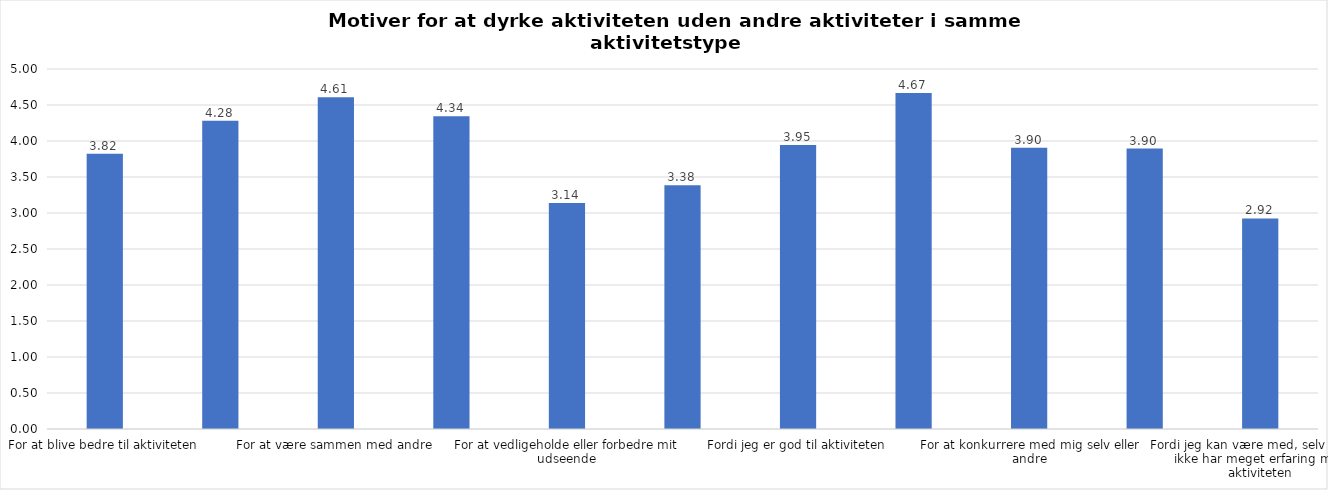
| Category | Gennemsnit |
|---|---|
| For at blive bedre til aktiviteten | 3.821 |
| For at vedligeholde eller forbedre min sundhed (fx helbred, fysisk form) | 4.283 |
| For at være sammen med andre | 4.607 |
| For at gøre noget godt for mig selv | 4.343 |
| For at vedligeholde eller forbedre mit udseende | 3.137 |
| Fordi andre i min omgangskreds opmuntrer mig til det | 3.384 |
| Fordi jeg er god til aktiviteten | 3.946 |
| Fordi jeg godt kan lide aktiviteten | 4.666 |
| For at konkurrere med mig selv eller andre | 3.905 |
| Fordi aktiviteten passer godt ind i min hverdag | 3.896 |
| Fordi jeg kan være med, selv om jeg ikke har meget erfaring med aktiviteten | 2.925 |